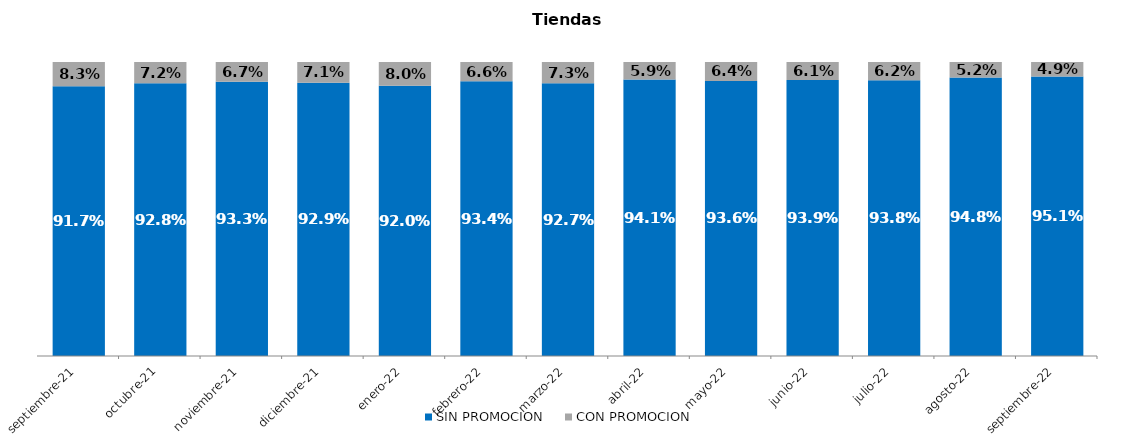
| Category | SIN PROMOCION   | CON PROMOCION   |
|---|---|---|
| 2021-09-01 | 0.917 | 0.083 |
| 2021-10-01 | 0.928 | 0.072 |
| 2021-11-01 | 0.933 | 0.067 |
| 2021-12-01 | 0.929 | 0.071 |
| 2022-01-01 | 0.92 | 0.08 |
| 2022-02-01 | 0.934 | 0.066 |
| 2022-03-01 | 0.927 | 0.073 |
| 2022-04-01 | 0.941 | 0.059 |
| 2022-05-01 | 0.936 | 0.064 |
| 2022-06-01 | 0.939 | 0.061 |
| 2022-07-01 | 0.938 | 0.062 |
| 2022-08-01 | 0.948 | 0.052 |
| 2022-09-01 | 0.951 | 0.049 |